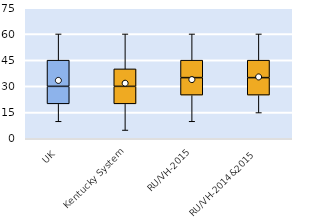
| Category | 25th | 50th | 75th |
|---|---|---|---|
| UK | 20 | 10 | 15 |
| Kentucky System | 20 | 10 | 10 |
| RU/VH-2015 | 25 | 10 | 10 |
| RU/VH-2014&2015 | 25 | 10 | 10 |